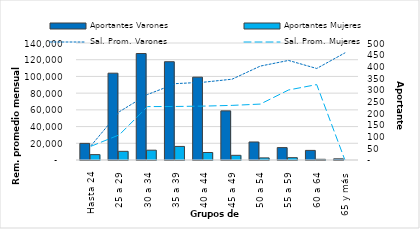
| Category | Aportantes Varones | Aportantes Mujeres |
|---|---|---|
| Hasta 24 | 71 | 23 |
| 25 a 29 | 371 | 37 |
| 30 a 34 | 455 | 42 |
| 35 a 39 | 420 | 58 |
| 40 a 44 | 354 | 32 |
| 45 a 49 | 210 | 20 |
| 50 a 54 | 77 | 9 |
| 55 a 59 | 53 | 10 |
| 60 a 64 | 41 | 3 |
| 65 y más | 5 | 0 |